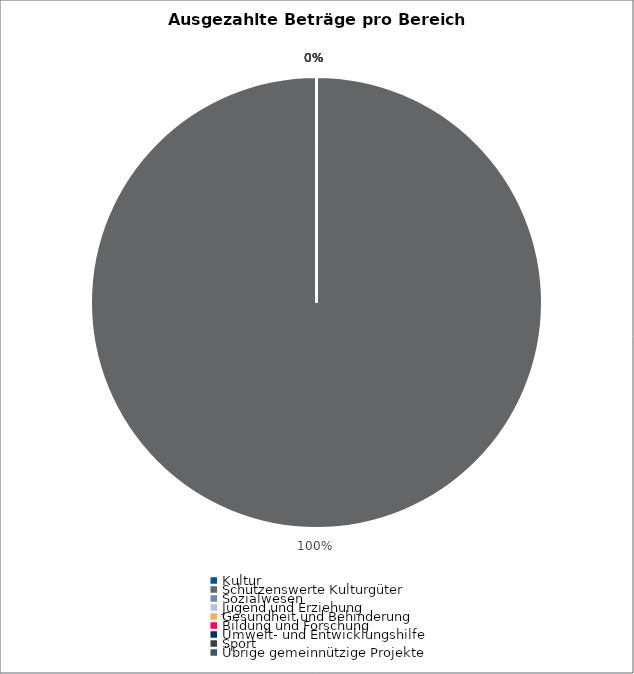
| Category | Series 0 |
|---|---|
| Kultur | 0 |
| Schützenswerte Kulturgüter | 6682026 |
| Sozialwesen | 0 |
| Jugend und Erziehung | 0 |
| Gesundheit und Behinderung | 0 |
| Bildung und Forschung | 0 |
| Umwelt- und Entwicklungshilfe | 0 |
| Sport | 0 |
| Übrige gemeinnützige Projekte | 0 |